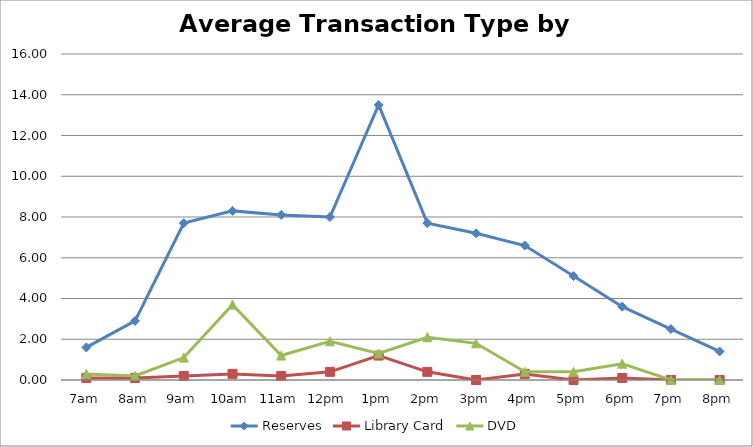
| Category | Reserves | Library Card | DVD |
|---|---|---|---|
| 7am | 1.6 | 0.1 | 0.3 |
| 8am | 2.9 | 0.1 | 0.2 |
| 9am | 7.7 | 0.2 | 1.1 |
| 10am | 8.3 | 0.3 | 3.7 |
| 11am | 8.1 | 0.2 | 1.2 |
| 12pm | 8 | 0.4 | 1.9 |
| 1pm | 13.5 | 1.2 | 1.3 |
| 2pm | 7.7 | 0.4 | 2.1 |
| 3pm | 7.2 | 0 | 1.8 |
| 4pm | 6.6 | 0.3 | 0.4 |
| 5pm | 5.1 | 0 | 0.4 |
| 6pm | 3.6 | 0.1 | 0.8 |
| 7pm | 2.5 | 0 | 0 |
| 8pm | 1.4 | 0 | 0 |